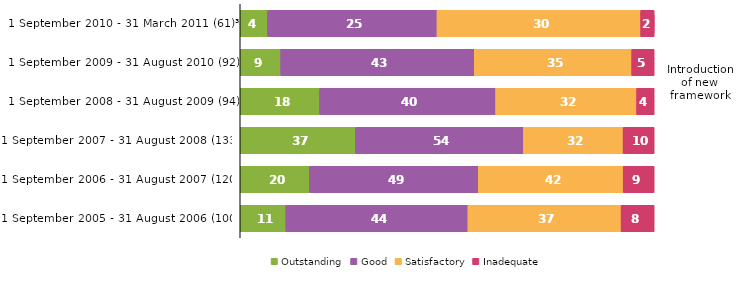
| Category | Outstanding | Good | Satisfactory | Inadequate |
|---|---|---|---|---|
| 1 September 2010 - 31 March 2011 (61)³ | 4 | 25 | 30 | 2 |
| 1 September 2009 - 31 August 2010 (92) | 9 | 43 | 35 | 5 |
| 1 September 2008 - 31 August 2009 (94) | 18 | 40 | 32 | 4 |
| 1 September 2007 - 31 August 2008 (133) | 37 | 54 | 32 | 10 |
| 1 September 2006 - 31 August 2007 (120) | 20 | 49 | 42 | 9 |
| 1 September 2005 - 31 August 2006 (100) | 11 | 44 | 37 | 8 |